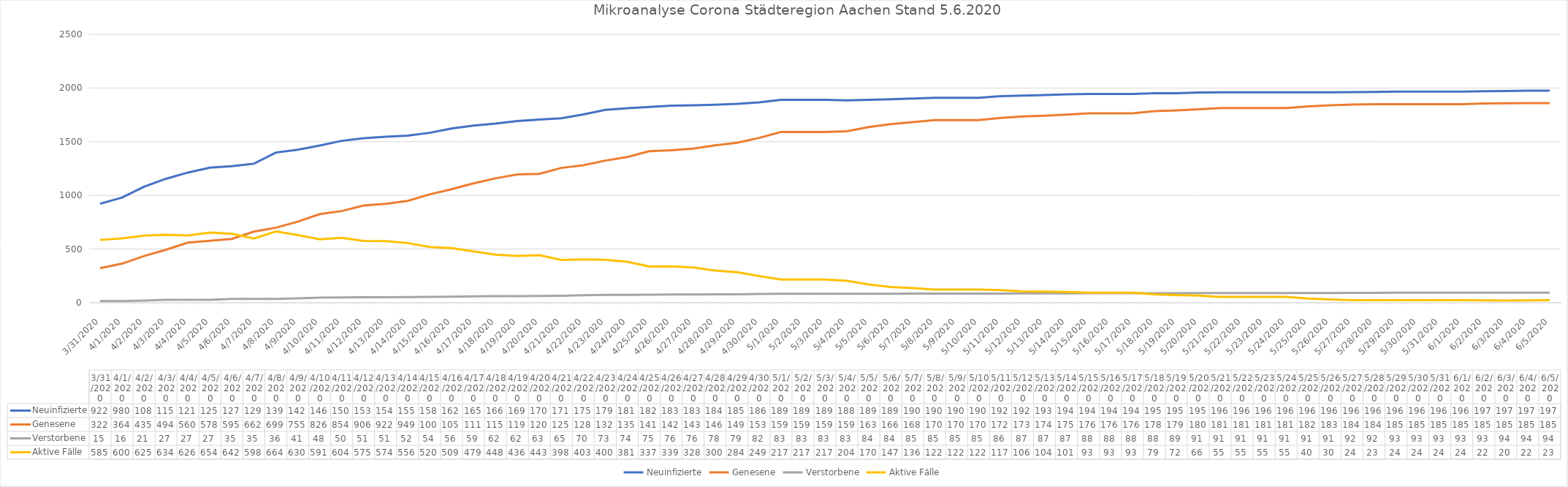
| Category | Neuinfizierte | Genesene | Verstorbene | Aktive Fälle |
|---|---|---|---|---|
| 3/31/20 | 922 | 322 | 15 | 585 |
| 4/1/20 | 980 | 364 | 16 | 600 |
| 4/2/20 | 1081 | 435 | 21 | 625 |
| 4/3/20 | 1155 | 494 | 27 | 634 |
| 4/4/20 | 1213 | 560 | 27 | 626 |
| 4/5/20 | 1259 | 578 | 27 | 654 |
| 4/6/20 | 1272 | 595 | 35 | 642 |
| 4/7/20 | 1295 | 662 | 35 | 598 |
| 4/8/20 | 1399 | 699 | 36 | 664 |
| 4/9/20 | 1426 | 755 | 41 | 630 |
| 4/10/20 | 1465 | 826 | 48 | 591 |
| 4/11/20 | 1508 | 854 | 50 | 604 |
| 4/12/20 | 1532 | 906 | 51 | 575 |
| 4/13/20 | 1547 | 922 | 51 | 574 |
| 4/14/20 | 1557 | 949 | 52 | 556 |
| 4/15/20 | 1583 | 1009 | 54 | 520 |
| 4/16/20 | 1623 | 1058 | 56 | 509 |
| 4/17/20 | 1650 | 1112 | 59 | 479 |
| 4/18/20 | 1669 | 1159 | 62 | 448 |
| 4/19/20 | 1693 | 1195 | 62 | 436 |
| 4/20/20 | 1707 | 1201 | 63 | 443 |
| 4/21/20 | 1719 | 1256 | 65 | 398 |
| 4/22/20 | 1754 | 1281 | 70 | 403 |
| 4/23/20 | 1797 | 1324 | 73 | 400 |
| 4/24/20 | 1812 | 1357 | 74 | 381 |
| 4/25/20 | 1824 | 1412 | 75 | 337 |
| 4/26/20 | 1835 | 1420 | 76 | 339 |
| 4/27/20 | 1839 | 1435 | 76 | 328 |
| 4/28/20 | 1845 | 1467 | 78 | 300 |
| 4/29/20 | 1853 | 1490 | 79 | 284 |
| 4/30/20 | 1866 | 1535 | 82 | 249 |
| 5/1/20 | 1891 | 1591 | 83 | 217 |
| 5/2/20 | 1891 | 1591 | 83 | 217 |
| 5/3/20 | 1891 | 1591 | 83 | 217 |
| 5/4/20 | 1885 | 1598 | 83 | 204 |
| 5/5/20 | 1890 | 1636 | 84 | 170 |
| 5/6/20 | 1895 | 1664 | 84 | 147 |
| 5/7/20 | 1903 | 1682 | 85 | 136 |
| 5/8/20 | 1909 | 1702 | 85 | 122 |
| 5/9/20 | 1909 | 1702 | 85 | 122 |
| 5/10/20 | 1909 | 1702 | 85 | 122 |
| 5/11/20 | 1924 | 1721 | 86 | 117 |
| 5/12/20 | 1929 | 1736 | 87 | 106 |
| 5/13/20 | 1934 | 1743 | 87 | 104 |
| 5/14/20 | 1941 | 1753 | 87 | 101 |
| 5/15/20 | 1945 | 1764 | 88 | 93 |
| 5/16/20 | 1945 | 1764 | 88 | 93 |
| 5/17/20 | 1945 | 1764 | 88 | 93 |
| 5/18/20 | 1951 | 1784 | 88 | 79 |
| 5/19/20 | 1952 | 1791 | 89 | 72 |
| 5/20/20 | 1958 | 1801 | 91 | 66 |
| 5/21/20 | 1960 | 1814 | 91 | 55 |
| 5/22/20 | 1960 | 1814 | 91 | 55 |
| 5/23/20 | 1960 | 1814 | 91 | 55 |
| 5/24/20 | 1960 | 1814 | 91 | 55 |
| 5/25/20 | 1960 | 1829 | 91 | 40 |
| 5/26/20 | 1960 | 1839 | 91 | 30 |
| 5/27/20 | 1962 | 1846 | 92 | 24 |
| 5/28/20 | 1964 | 1849 | 92 | 23 |
| 5/29/20 | 1967 | 1850 | 93 | 24 |
| 5/30/20 | 1967 | 1850 | 93 | 24 |
| 5/31/20 | 1967 | 1850 | 93 | 24 |
| 6/1/20 | 1967 | 1850 | 93 | 24 |
| 6/2/20 | 1971 | 1856 | 93 | 22 |
| 6/3/20 | 1972 | 1858 | 94 | 20 |
| 6/4/20 | 1975 | 1859 | 94 | 22 |
| 6/5/20 | 1976 | 1859 | 94 | 23 |